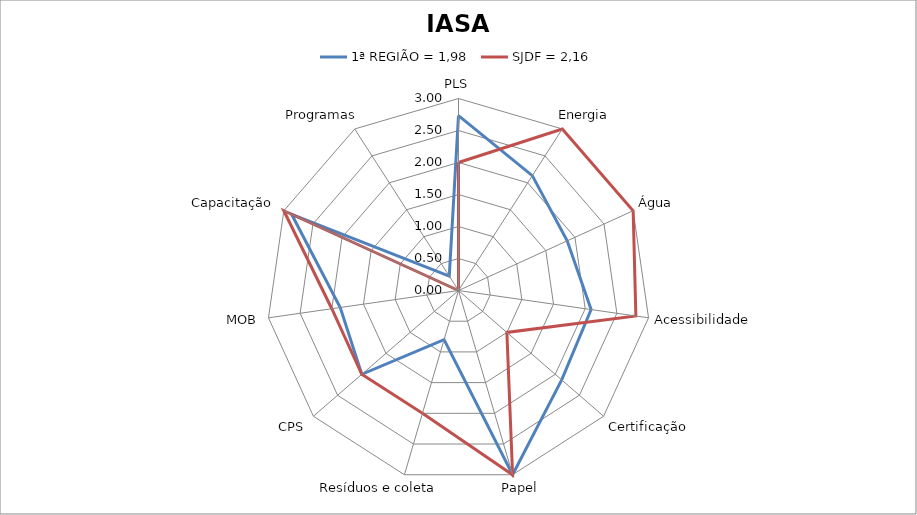
| Category | 1ª REGIÃO = 1,98 | SJDF = 2,16 |
|---|---|---|
| PLS | 2.733 | 2 |
| Energia | 2.133 | 3 |
| Água | 1.867 | 3 |
| Acessibilidade | 2.093 | 2.8 |
| Certificação | 2.133 | 1 |
| Papel | 3 | 3 |
| Resíduos e coleta | 0.8 | 2 |
| CPS | 2 | 2 |
| MOB | 1.867 | 2 |
| Capacitação | 2.867 | 3 |
| Programas | 0.267 | 0 |